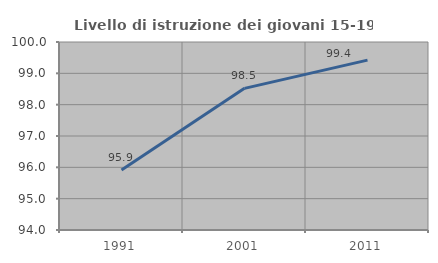
| Category | Livello di istruzione dei giovani 15-19 anni |
|---|---|
| 1991.0 | 95.916 |
| 2001.0 | 98.521 |
| 2011.0 | 99.42 |